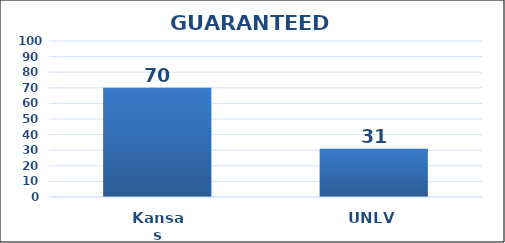
| Category | Series 0 |
|---|---|
| Kansas | 70 |
| UNLV | 31 |